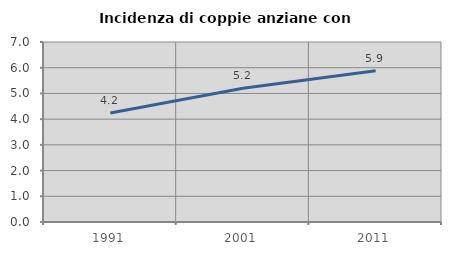
| Category | Incidenza di coppie anziane con figli |
|---|---|
| 1991.0 | 4.24 |
| 2001.0 | 5.2 |
| 2011.0 | 5.882 |